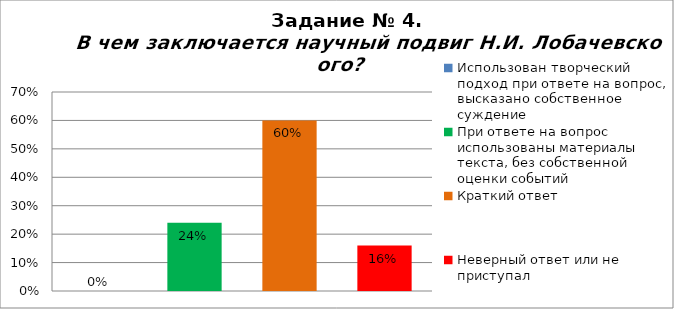
| Category | В чем заключается научный подвиг Н.И. Лобачевского? |
|---|---|
| Использован творческий подход при ответе на вопрос, высказано собственное суждение | 0 |
| При ответе на вопрос использованы материалы текста, без собственной оценки событий | 0.24 |
| Краткий ответ | 0.6 |
| Неверный ответ или не приступал | 0.16 |